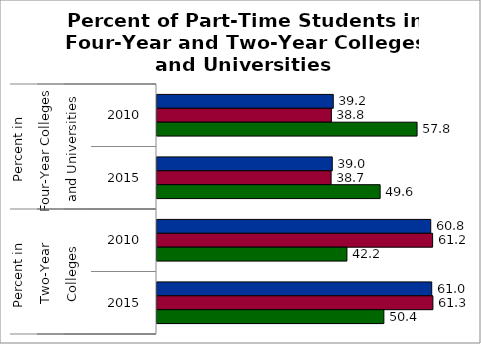
| Category | 50 states and D.C. | SREB states | State |
|---|---|---|---|
| 0 | 39.167 | 38.753 | 57.793 |
| 1 | 38.951 | 38.69 | 49.586 |
| 2 | 60.833 | 61.247 | 42.207 |
| 3 | 61.049 | 61.31 | 50.414 |